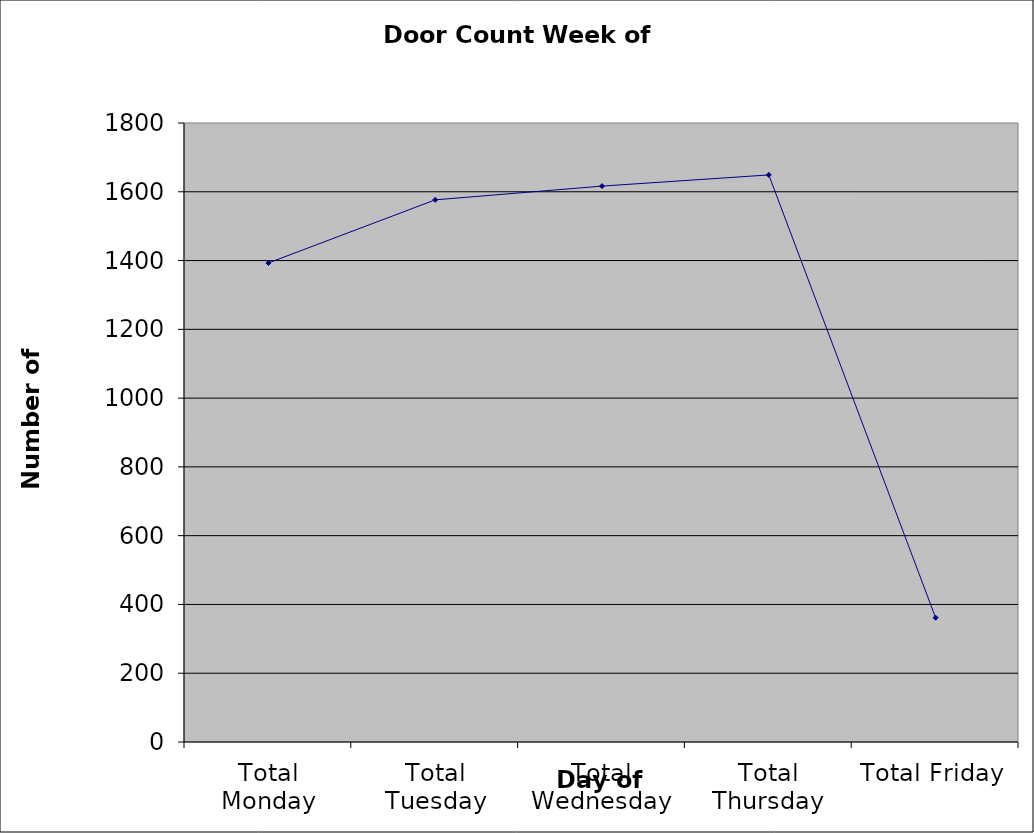
| Category | Series 0 |
|---|---|
| Total Monday | 1393 |
| Total Tuesday | 1576.5 |
| Total Wednesday | 1616.5 |
| Total Thursday | 1649 |
| Total Friday | 361.5 |